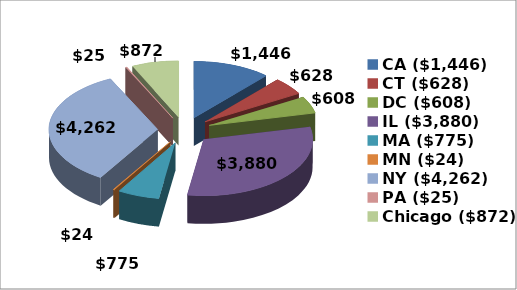
| Category | Series 0 |
|---|---|
| CA ($1,446) | 1446 |
| CT ($628) | 628 |
| DC ($608) | 608 |
| IL ($3,880) | 3879.53 |
| MA ($775) | 775 |
| MN ($24) | 23.75 |
| NY ($4,262) | 4262.2 |
| PA ($25) | 25 |
| Chicago ($872) | 871.9 |